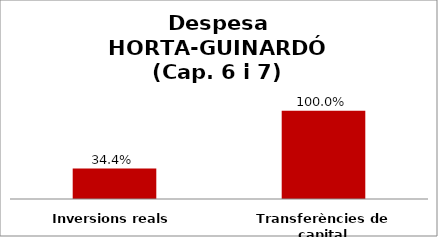
| Category | Series 0 |
|---|---|
| Inversions reals | 0.344 |
| Transferències de capital | 1 |